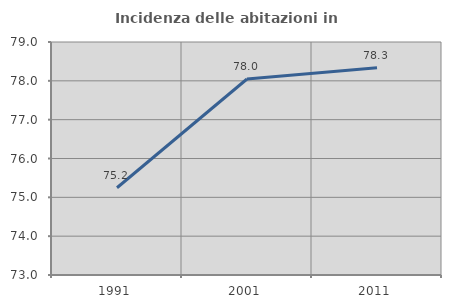
| Category | Incidenza delle abitazioni in proprietà  |
|---|---|
| 1991.0 | 75.247 |
| 2001.0 | 78.047 |
| 2011.0 | 78.335 |